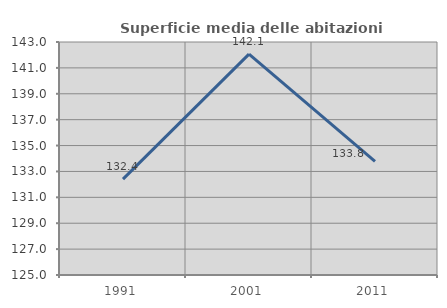
| Category | Superficie media delle abitazioni occupate |
|---|---|
| 1991.0 | 132.404 |
| 2001.0 | 142.068 |
| 2011.0 | 133.782 |